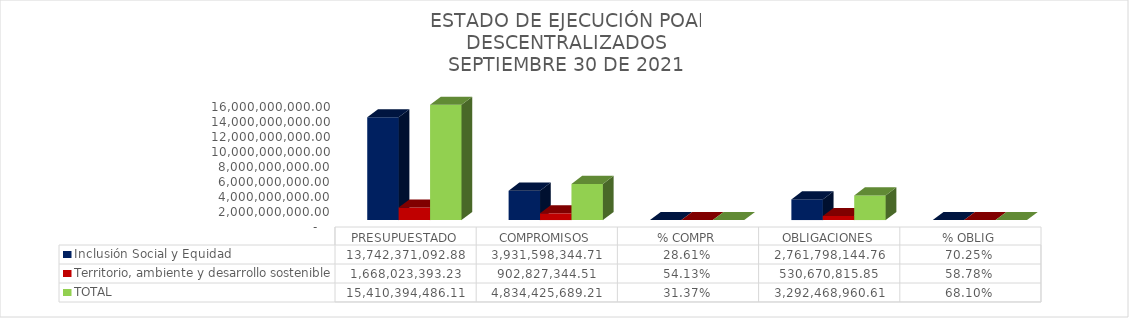
| Category | Inclusión Social y Equidad | Territorio, ambiente y desarrollo sostenible | TOTAL |
|---|---|---|---|
| PRESUPUESTADO | 13742371092.88 | 1668023393.23 | 15410394486.11 |
| COMPROMISOS | 3931598344.706 | 902827344.506 | 4834425689.212 |
| % COMPR | 0.286 | 0.541 | 0.314 |
| OBLIGACIONES | 2761798144.76 | 530670815.846 | 3292468960.606 |
| % OBLIG | 0.702 | 0.588 | 0.681 |